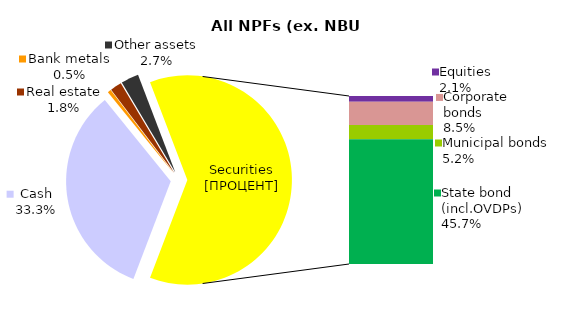
| Category | All NPF (ex. NBU CNPF) |
|---|---|
| Cash | 669.349 |
| Bank metals | 10.485 |
| Real estate | 35.602 |
| Other assets | 55.073 |
| Equities | 42.759 |
| Corporate bonds | 171.431 |
| Municipal bonds | 104.799 |
| State bond (incl.OVDPs) | 917.791 |